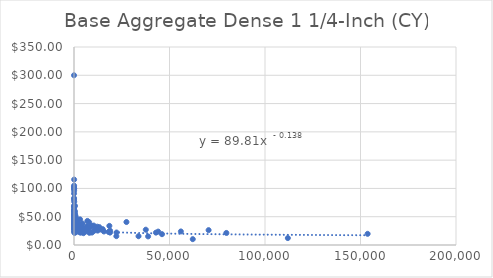
| Category | Base Aggregate Dense 1 1/4-Inch |
|---|---|
| 7.0 | 68.48 |
| 185.0 | 37.18 |
| 80.0 | 29.22 |
| 423.0 | 51.24 |
| 9400.0 | 22 |
| 67.5 | 96 |
| 33.5 | 38.66 |
| 119.0 | 76.48 |
| 1434.5 | 31.5 |
| 856.0 | 36 |
| 4000.0 | 36.74 |
| 24.5 | 82.88 |
| 240.0 | 39.06 |
| 454.0 | 33.26 |
| 11220.0 | 27.58 |
| 400.0 | 37.84 |
| 60.0 | 43.52 |
| 1225.0 | 31.58 |
| 50.0 | 99.4 |
| 362.5 | 36.26 |
| 855.0 | 50.4 |
| 7965.0 | 40.08 |
| 13950.0 | 27.48 |
| 185.0 | 55.12 |
| 755.0 | 30 |
| 41.0 | 39 |
| 265.0 | 43.18 |
| 9385.0 | 33.8 |
| 3349.5 | 31.52 |
| 30.0 | 80 |
| 956.0 | 22.64 |
| 15.0 | 60 |
| 109.0 | 50 |
| 371.5 | 58.58 |
| 1870.0 | 30.8 |
| 38800.0 | 15.2 |
| 3000.0 | 22.82 |
| 182.5 | 61.2 |
| 84.0 | 45.26 |
| 55.0 | 63.5 |
| 280.0 | 59.6 |
| 294.5 | 35.02 |
| 83.0 | 52.14 |
| 65.0 | 46.76 |
| 100.0 | 53.42 |
| 105.0 | 70 |
| 27461.0 | 40.6 |
| 1115.0 | 27.5 |
| 752.5 | 34 |
| 3199.5 | 25.64 |
| 1852.0 | 27.8 |
| 506.0 | 27.12 |
| 26.0 | 91 |
| 290.0 | 40 |
| 111958.0 | 12.24 |
| 1053.5 | 40.82 |
| 65.0 | 51 |
| 18882.5 | 25.28 |
| 360.0 | 33.7 |
| 112.5 | 48.5 |
| 80.0 | 47.14 |
| 3830.0 | 35.02 |
| 67.5 | 48.48 |
| 10.0 | 102.8 |
| 70.0 | 61.1 |
| 230.0 | 45.62 |
| 1079.5 | 31.5 |
| 90.0 | 50.34 |
| 77.0 | 46.8 |
| 13158.5 | 29.5 |
| 75.0 | 46.5 |
| 360.0 | 30.9 |
| 510.0 | 28.08 |
| 332.5 | 33.64 |
| 119.0 | 42.7 |
| 387.5 | 32.2 |
| 12232.5 | 32.38 |
| 4962.0 | 28.04 |
| 490.0 | 30 |
| 1741.0 | 27.32 |
| 12384.0 | 25.46 |
| 452.5 | 30.96 |
| 7015.0 | 42.58 |
| 4348.0 | 29.64 |
| 225.0 | 46.2 |
| 500.0 | 31 |
| 18855.0 | 21.9 |
| 515.0 | 28.18 |
| 33782.0 | 15.5 |
| 595.5 | 42.1 |
| 10459.5 | 24.98 |
| 2216.0 | 27.6 |
| 87.5 | 35.48 |
| 4235.0 | 28.5 |
| 79.5 | 66.8 |
| 22173.5 | 15.64 |
| 95.0 | 58.6 |
| 85.0 | 100 |
| 72.5 | 46.14 |
| 100.0 | 36.2 |
| 601.5 | 30.18 |
| 324.0 | 44.72 |
| 888.5 | 34.76 |
| 40.0 | 38.4 |
| 102.0 | 40.14 |
| 7459.5 | 27.34 |
| 85.0 | 28.88 |
| 85.0 | 35.16 |
| 180.0 | 31.34 |
| 175.0 | 40.4 |
| 82.5 | 30 |
| 350.0 | 32 |
| 1535.0 | 33.9 |
| 35.0 | 52.02 |
| 814.5 | 48.76 |
| 4491.5 | 37.94 |
| 185.0 | 30.72 |
| 3197.5 | 32 |
| 3441.5 | 21.76 |
| 1886.5 | 24.1 |
| 475.0 | 29.14 |
| 300.0 | 24 |
| 8080.5 | 21.54 |
| 2102.5 | 31.4 |
| 433.0 | 42.84 |
| 4035.0 | 24.5 |
| 295.0 | 57 |
| 79770.0 | 21.32 |
| 6974.5 | 33.32 |
| 132.5 | 36.6 |
| 242.0 | 31.3 |
| 1736.0 | 29.92 |
| 135.0 | 30.5 |
| 540.0 | 31.6 |
| 432.5 | 33 |
| 310.0 | 33 |
| 210.5 | 40.26 |
| 932.0 | 29.74 |
| 199.0 | 29 |
| 3340.0 | 29.92 |
| 18100.0 | 23.04 |
| 153737.0 | 19.74 |
| 37593.5 | 27.04 |
| 3929.5 | 25.86 |
| 22275.0 | 22.08 |
| 106.5 | 22.6 |
| 755.0 | 29.82 |
| 42.0 | 55 |
| 1472.0 | 40.6 |
| 46078.0 | 19.12 |
| 430.0 | 43.08 |
| 3173.0 | 45.3 |
| 705.0 | 36.2 |
| 18514.0 | 33.82 |
| 320.0 | 21.34 |
| 1362.5 | 33.5 |
| 237.5 | 43.9 |
| 15029.5 | 28 |
| 635.0 | 39.5 |
| 55960.5 | 23.96 |
| 3900.0 | 27.2 |
| 62.5 | 45.62 |
| 4959.5 | 20.9 |
| 650.0 | 34 |
| 13277.5 | 31.56 |
| 6000.0 | 30 |
| 8507.5 | 32.12 |
| 517.5 | 26.14 |
| 254.0 | 31.5 |
| 416.0 | 37.9 |
| 2070.0 | 31.96 |
| 32.5 | 61.6 |
| 402.0 | 42.96 |
| 3465.0 | 35.7 |
| 445.0 | 31.8 |
| 70472.5 | 26.26 |
| 40.0 | 51.66 |
| 80.0 | 28 |
| 70.5 | 115.66 |
| 698.0 | 47.04 |
| 15649.5 | 23.9 |
| 2936.5 | 31.9 |
| 60.0 | 60 |
| 1929.0 | 26.86 |
| 42904.0 | 21.86 |
| 450.0 | 40.36 |
| 1742.5 | 34.24 |
| 620.0 | 42.36 |
| 640.5 | 32.18 |
| 1045.0 | 28.58 |
| 587.5 | 53.86 |
| 315.0 | 27.9 |
| 2224.0 | 29.6 |
| 496.5 | 35.8 |
| 417.0 | 49.72 |
| 1937.5 | 38.96 |
| 350.0 | 27.1 |
| 289.5 | 36 |
| 474.0 | 69.24 |
| 134.0 | 60 |
| 44071.5 | 23.68 |
| 617.0 | 28.44 |
| 5304.5 | 27.38 |
| 884.5 | 36.58 |
| 10340.0 | 34.36 |
| 62186.5 | 10.32 |
| 3115.0 | 27.72 |
| 1015.5 | 32.02 |
| 3144.5 | 29.4 |
| 719.5 | 44.2 |
| 34.0 | 53 |
| 182.5 | 67.84 |
| 157.5 | 37 |
| 542.5 | 42.4 |
| 42.5 | 105 |
| 6253.5 | 24.12 |
| 8.5 | 300 |
| 119.0 | 25.06 |
| 78.0 | 43.25 |